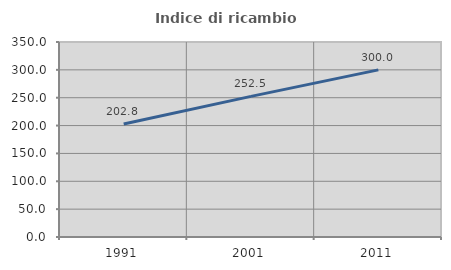
| Category | Indice di ricambio occupazionale  |
|---|---|
| 1991.0 | 202.778 |
| 2001.0 | 252.459 |
| 2011.0 | 300 |